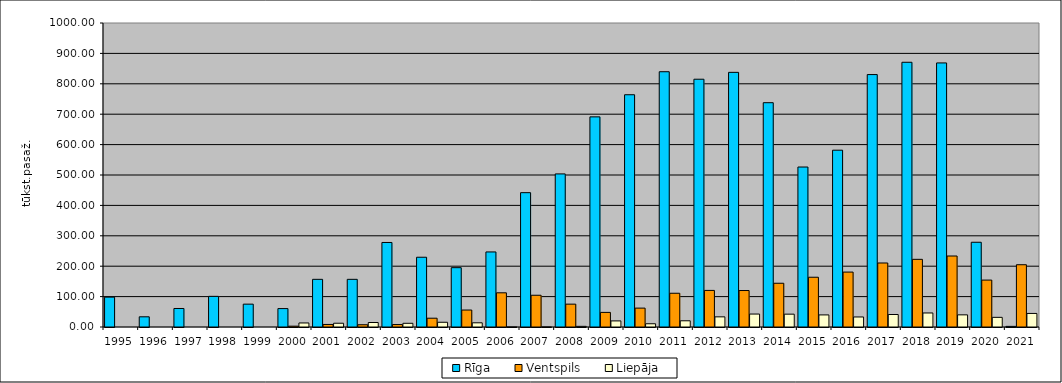
| Category | Rīga | Ventspils | Liepāja |
|---|---|---|---|
| 1995.0 | 98.19 | 0 | 0 |
| 1996.0 | 33.55 | 0 | 0 |
| 1997.0 | 60.88 | 0 | 0 |
| 1998.0 | 100.833 | 0 | 0 |
| 1999.0 | 75.147 | 0 | 0 |
| 2000.0 | 60.586 | 2.681 | 13.311 |
| 2001.0 | 156.77 | 8.37 | 12.356 |
| 2002.0 | 156.77 | 7.404 | 14.786 |
| 2003.0 | 278.028 | 8.032 | 12.162 |
| 2004.0 | 229.474 | 28.887 | 15.53 |
| 2005.0 | 195.195 | 55.788 | 13.812 |
| 2006.0 | 246.885 | 112.46 | 0.153 |
| 2007.0 | 441.914 | 104.422 | 0.116 |
| 2008.0 | 503.594 | 75.174 | 2.115 |
| 2009.0 | 691.236 | 48.012 | 20.041 |
| 2010.0 | 764.001 | 62.109 | 10.674 |
| 2011.0 | 839.712 | 111.019 | 20.432 |
| 2012.0 | 815.026 | 120.344 | 33.361 |
| 2013.0 | 837.665 | 120.014 | 42.607 |
| 2014.0 | 737.865 | 143.891 | 42.203 |
| 2015.0 | 526.243 | 163.666 | 39.782 |
| 2016.0 | 581.577 | 180.632 | 32.992 |
| 2017.0 | 830.38 | 210.532 | 41.111 |
| 2018.0 | 870.825 | 222.562 | 46.113 |
| 2019.0 | 868.656 | 233.537 | 39.987 |
| 2020.0 | 278.759 | 154.347 | 31.731 |
| 2021.0 | 2.005 | 204.843 | 44.612 |